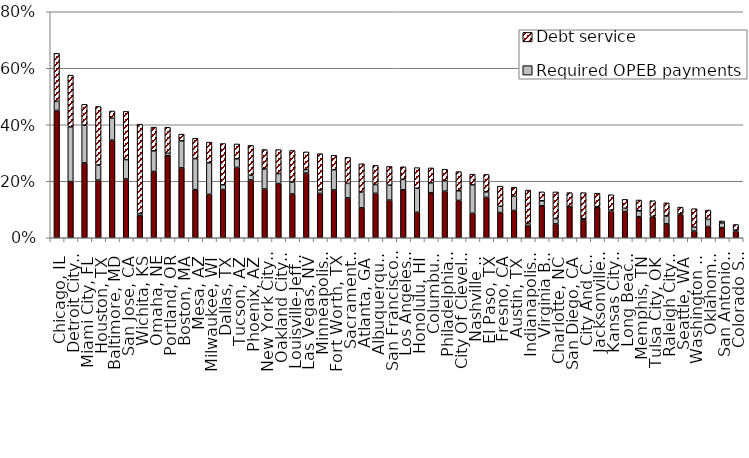
| Category | Required pension payments | Required OPEB payments | Debt service |
|---|---|---|---|
| Chicago, IL | 0.451 | 0.032 | 0.17 |
| Detroit City, MI | 0.199 | 0.194 | 0.183 |
| Miami City, FL | 0.265 | 0.133 | 0.074 |
| Houston, TX | 0.204 | 0.053 | 0.208 |
| Baltimore, MD | 0.346 | 0.078 | 0.025 |
| San Jose, CA | 0.208 | 0.069 | 0.171 |
| Wichita, KS | 0.078 | 0.007 | 0.316 |
| Omaha, NE | 0.235 | 0.073 | 0.084 |
| Portland, OR | 0.29 | 0.008 | 0.092 |
| Boston, MA | 0.247 | 0.096 | 0.024 |
| Mesa, AZ | 0.17 | 0.11 | 0.072 |
| Milwaukee, WI | 0.154 | 0.112 | 0.073 |
| Dallas, TX | 0.171 | 0.017 | 0.146 |
| Tucson, AZ | 0.249 | 0.031 | 0.053 |
| Phoenix, AZ | 0.205 | 0.017 | 0.106 |
| New York City, NY | 0.173 | 0.071 | 0.069 |
| Oakland City, CA | 0.192 | 0.035 | 0.085 |
| Louisville-Jefferson County, KY | 0.155 | 0.042 | 0.111 |
| Las Vegas, NV | 0.229 | 0.012 | 0.063 |
| Minneapolis, MN | 0.157 | 0.012 | 0.129 |
| Fort Worth, TX | 0.169 | 0.072 | 0.051 |
| Sacramento City, CA | 0.141 | 0.051 | 0.092 |
| Atlanta, GA | 0.106 | 0.056 | 0.1 |
| Albuquerque City, NM | 0.157 | 0.031 | 0.068 |
| San Francisco, CA | 0.133 | 0.053 | 0.066 |
| Los Angeles, CA | 0.17 | 0.037 | 0.045 |
| Honolulu, HI | 0.09 | 0.085 | 0.073 |
| Columbus City, OH | 0.16 | 0.034 | 0.053 |
| Philadelphia, PA | 0.165 | 0.037 | 0.041 |
| City Of Cleveland, OH | 0.132 | 0.034 | 0.068 |
| Nashville & Davidson County, TN | 0.086 | 0.101 | 0.037 |
| El Paso, TX | 0.143 | 0.02 | 0.062 |
| Fresno, CA | 0.089 | 0.022 | 0.071 |
| Austin, TX | 0.097 | 0.05 | 0.032 |
| Indianapolis, IN | 0.044 | 0.008 | 0.117 |
| Virginia Beach, VA | 0.113 | 0.018 | 0.032 |
| Charlotte, NC | 0.049 | 0.019 | 0.094 |
| San Diego, CA | 0.111 | 0 | 0.049 |
| City And County Of Denver, CO | 0.063 | 0.004 | 0.092 |
| Jacksonville, FL | 0.106 | 0.004 | 0.048 |
| Kansas City, MO | 0.094 | 0.004 | 0.055 |
| Long Beach City, CA | 0.093 | 0.011 | 0.031 |
| Memphis, TN | 0.075 | 0.021 | 0.038 |
| Tulsa City, OK | 0.074 | 0.002 | 0.056 |
| Raleigh City, NC | 0.049 | 0.028 | 0.046 |
| Seattle, WA | 0.082 | 0.002 | 0.025 |
| Washington D C, DC | 0.024 | 0.014 | 0.065 |
| Oklahoma City, OK | 0.04 | 0.025 | 0.033 |
| San Antonio, TX | 0.036 | 0.016 | 0.007 |
| Colorado Springs, CO | 0.023 | 0.004 | 0.02 |